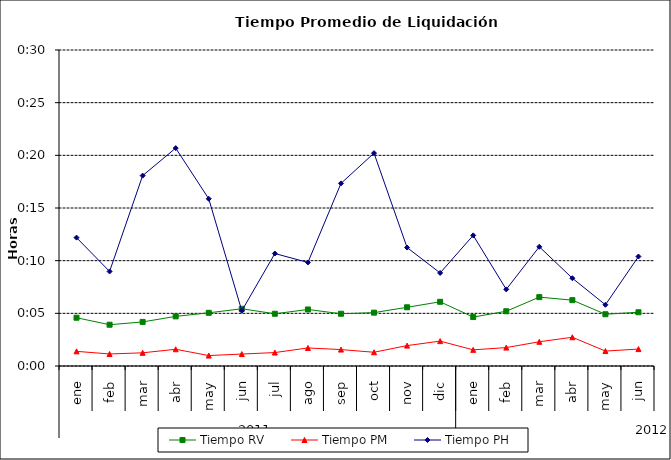
| Category | Tiempo RV | Tiempo PM | Tiempo PH |
|---|---|---|---|
| 0 | 0.003 | 0.001 | 0.009 |
| 1 | 0.003 | 0.001 | 0.006 |
| 2 | 0.003 | 0.001 | 0.013 |
| 3 | 0.003 | 0.001 | 0.014 |
| 4 | 0.004 | 0.001 | 0.011 |
| 5 | 0.004 | 0.001 | 0.004 |
| 6 | 0.003 | 0.001 | 0.007 |
| 7 | 0.004 | 0.001 | 0.007 |
| 8 | 0.003 | 0.001 | 0.012 |
| 9 | 0.004 | 0.001 | 0.014 |
| 10 | 0.004 | 0.001 | 0.008 |
| 11 | 0.004 | 0.002 | 0.006 |
| 12 | 0.003 | 0.001 | 0.009 |
| 13 | 0.004 | 0.001 | 0.005 |
| 14 | 0.005 | 0.002 | 0.008 |
| 15 | 0.004 | 0.002 | 0.006 |
| 16 | 0.003 | 0.001 | 0.004 |
| 17 | 0.004 | 0.001 | 0.007 |